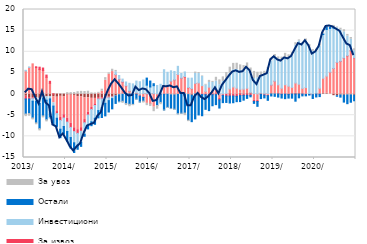
| Category | По трансакционим рачунима | За ликвидност и обртна средства  | За извоз | Инвестициони | Остали | За увоз |
|---|---|---|---|---|---|---|
| 2013-01-01 | -0.509 | 5.466 | -0.655 | 0.157 | -3.557 | -0.62 |
| 2013-02-01 | -0.821 | 6.307 | -0.351 | 0.101 | -3.442 | -0.636 |
| 2013-03-01 | -0.908 | 7.144 | -0.174 | -0.604 | -3.955 | -0.473 |
| 2013-04-01 | -0.906 | 6.265 | 0.188 | -0.805 | -5.11 | -0.441 |
| 2013-05-01 | -1.028 | 5.791 | 0.566 | -1.205 | -5.942 | -0.539 |
| 2013-06-01 | -0.715 | 5.566 | 0.59 | -0.246 | -4.209 | -0.467 |
| 2013-07-01 | -0.656 | 3.962 | 0.527 | -0.788 | -4.619 | -0.522 |
| 2013-08-01 | -0.571 | 2.543 | 0.475 | -0.574 | -4.455 | -0.211 |
| 2013-09-01 | -0.597 | -1.463 | 0.046 | -0.788 | -4.325 | -0.17 |
| 2013-10-01 | -0.731 | -3.405 | -0.479 | -1.101 | -1.998 | -0.034 |
| 2013-11-01 | -0.534 | -5.012 | -0.697 | -2.071 | -1.999 | 0.032 |
| 2013-12-01 | -0.631 | -4.25 | -0.793 | -2 | -1.812 | 0.042 |
| 2014-01-01 | -0.248 | -5.468 | -0.921 | -2.223 | -2.314 | 0.338 |
| 2014-02-01 | -0.244 | -6.677 | -0.967 | -2.397 | -2.478 | 0.345 |
| 2014-03-01 | -0.312 | -7.664 | -0.914 | -2.634 | -2.299 | 0.368 |
| 2014-04-01 | -0.598 | -7.82 | -0.878 | -2.779 | -0.977 | 0.561 |
| 2014-05-01 | -0.678 | -7.271 | -0.835 | -2.63 | -0.953 | 0.634 |
| 2014-06-01 | -0.89 | -5.133 | -0.763 | -2.735 | -0.458 | 0.61 |
| 2014-07-01 | -0.861 | -3.427 | -0.672 | -2.518 | -0.758 | 0.681 |
| 2014-08-01 | -1.004 | -2.174 | -0.467 | -2.918 | -0.917 | 0.276 |
| 2014-09-01 | -1.021 | -1.308 | -0.375 | -3.018 | -1.426 | 0.243 |
| 2014-10-01 | -0.819 | 0.161 | -0.34 | -2.752 | -1.718 | 0.247 |
| 2014-11-01 | -0.858 | 0.695 | -0.279 | -2.093 | -2.317 | 0.459 |
| 2014-12-01 | -0.577 | 3.263 | -0.264 | -1.35 | -2.967 | 0.625 |
| 2015-01-01 | -0.712 | 4.673 | -0.142 | -0.704 | -2.68 | 0.34 |
| 2015-02-01 | -0.565 | 5.321 | -0.111 | -0.407 | -2.409 | 0.553 |
| 2015-03-01 | -0.434 | 4.59 | 0.008 | 0.669 | -1.773 | 0.324 |
| 2015-04-01 | -0.175 | 3.498 | 0.044 | 0.845 | -1.638 | -0.132 |
| 2015-05-01 | -0.054 | 2.82 | 0.068 | 0.654 | -1.651 | -0.488 |
| 2015-06-01 | 0.05 | 1.84 | 0.063 | 0.904 | -2.258 | -0.459 |
| 2015-07-01 | 0.129 | 0.502 | 0.07 | 1.849 | -2.403 | -0.592 |
| 2015-08-01 | 0.104 | 0.009 | -0.067 | 2.291 | -2.376 | -0.307 |
| 2015-09-01 | 0.112 | 0.208 | -0.055 | 2.751 | -1.148 | -0.214 |
| 2015-10-01 | 0.038 | -0.411 | -0.06 | 2.883 | -1.421 | -0.215 |
| 2015-11-01 | 0.131 | -0.703 | -0.076 | 3.2 | -0.895 | -0.44 |
| 2015-12-01 | 0.06 | -2.198 | 0.008 | 2.045 | 1.664 | -0.542 |
| 2016-01-01 | 0.112 | -2.269 | -0.03 | 1.566 | 1.404 | -0.65 |
| 2016-02-01 | 0.086 | -3.097 | 0.005 | 1.894 | 0.462 | -1.069 |
| 2016-03-01 | 0.054 | -1.187 | -0.022 | 1.97 | -1.494 | -0.878 |
| 2016-04-01 | 0.002 | 0.259 | -0.024 | 2.055 | -1.952 | -0.542 |
| 2016-05-01 | -0.049 | 2.232 | -0.014 | 3.525 | -3.719 | -0.201 |
| 2016-06-01 | -0.049 | 2.038 | 0.004 | 3.11 | -3.101 | -0.262 |
| 2016-07-01 | -0.188 | 3.046 | 0.004 | 2.456 | -3.237 | -0.159 |
| 2016-08-01 | -0.222 | 3.353 | 0.003 | 1.994 | -3.361 | -0.259 |
| 2016-09-01 | -0.107 | 4.637 | 0.003 | 1.923 | -4.549 | -0.209 |
| 2016-10-01 | -0.069 | 3.752 | 0.02 | 1.099 | -4.471 | -0.197 |
| 2016-11-01 | 0.003 | 4.032 | 0.118 | 1.076 | -4.499 | -0.6 |
| 2016-12-01 | -0.126 | 1.493 | 0.07 | 2.199 | -6.059 | -0.332 |
| 2017-01-01 | -0.287 | 1.255 | 0.034 | 2.468 | -6.239 | 0.016 |
| 2017-02-01 | -0.028 | 2.502 | 0.033 | 2.337 | -5.845 | 0.328 |
| 2017-03-01 | -0.212 | 2.639 | -0.061 | 2.218 | -4.66 | 0.242 |
| 2017-04-01 | 0.006 | 1.986 | -0.118 | 2.178 | -5.005 | 0.123 |
| 2017-05-01 | -0.021 | 0.622 | -0.131 | 1.488 | -3.457 | 0.202 |
| 2017-06-01 | -0.058 | 1.637 | -0.146 | 1.1 | -3.715 | 0.504 |
| 2017-07-01 | 0.066 | 0.742 | -0.146 | 1.936 | -2.615 | 0.257 |
| 2017-08-01 | 0.095 | 1.091 | -0.147 | 1.891 | -2.348 | 0.891 |
| 2017-09-01 | -0.033 | -1.003 | -0.338 | 2.229 | -1.931 | 1.128 |
| 2017-10-01 | 0.035 | -0.002 | -0.349 | 2.95 | -1.675 | 1.076 |
| 2017-11-01 | -0.038 | 0.191 | -0.423 | 3.298 | -1.519 | 1.614 |
| 2017-12-01 | 0.111 | 1.115 | -0.472 | 3.68 | -1.636 | 1.452 |
| 2018-01-01 | -0.017 | 1.678 | -0.449 | 4.093 | -1.582 | 1.485 |
| 2018-02-01 | -0.076 | 1.395 | -0.446 | 4.432 | -1.275 | 1.464 |
| 2018-03-01 | 0.181 | 0.968 | -0.353 | 4.465 | -1.426 | 1.286 |
| 2018-04-01 | 0.071 | 1.103 | -0.297 | 4.181 | -1.141 | 1.381 |
| 2018-05-01 | 0.137 | 1.251 | -0.296 | 4.4 | -0.726 | 1.574 |
| 2018-06-01 | 0.284 | 0.134 | -0.277 | 4.559 | -0.377 | 1.191 |
| 2018-07-01 | 0.145 | -1.444 | -0.282 | 3.523 | -0.476 | 1.691 |
| 2018-08-01 | 0.047 | -1.482 | -0.277 | 3.826 | -1.138 | 1.281 |
| 2018-09-01 | 0.187 | 0.07 | -0.088 | 3.999 | -0.981 | 0.962 |
| 2018-10-01 | 0.165 | -0.154 | -0.086 | 4.312 | -0.67 | 0.902 |
| 2018-11-01 | 0.151 | -0.294 | -0.083 | 5.778 | -1.1 | 0.383 |
| 2018-12-01 | 0.121 | 2.002 | 0.005 | 5.72 | -0.449 | 0.69 |
| 2019-01-01 | 0.084 | 2.964 | 0.003 | 5.799 | -0.532 | 0.511 |
| 2019-02-01 | 0.122 | 2.071 | -0.001 | 6.112 | -0.71 | 0.483 |
| 2019-03-01 | -0.043 | 1.384 | -0.007 | 6.432 | -0.89 | 0.926 |
| 2019-04-01 | -0.017 | 2.209 | -0.007 | 6.458 | -1.061 | 0.975 |
| 2019-05-01 | -0.065 | 1.864 | -0.007 | 6.82 | -0.881 | 0.597 |
| 2019-06-01 | 0.071 | 1.52 | -0.011 | 7.649 | -0.954 | 0.599 |
| 2019-07-01 | 0.174 | 2.439 | -0.011 | 8.965 | -1.672 | 0.577 |
| 2019-08-01 | 0.114 | 2.222 | -0.011 | 10.233 | -0.877 | 0.238 |
| 2019-09-01 | 0.013 | 1.329 | -0.011 | 10.479 | -0.423 | 0.206 |
| 2019-10-31 | -0.066 | 1.541 | -0.01 | 11.047 | -0.342 | 0.436 |
| 2019-11-30 | -0.091 | 0.084 | -0.01 | 10.759 | -0.137 | 0.843 |
| 2019-12-31 | -0.112 | -0.022 | -0.01 | 10.098 | -0.896 | 0.408 |
| 2020-01-31 | 0.054 | 0.141 | -0.01 | 9.923 | -0.677 | 0.532 |
| 2020-02-29 | -0.038 | 1.384 | -0.005 | 9.987 | -0.557 | 0.483 |
| 2020-03-31 | 0.142 | 3.609 | 0 | 10.341 | 0.142 | 0.224 |
| 2020-04-30 | 0.16 | 4.087 | 0 | 11.041 | 0.559 | 0.149 |
| 2020-05-31 | -0.034 | 5.187 | 0.005 | 10.338 | 0.308 | 0.306 |
| 2020-06-30 | -0.38 | 6.042 | 0.022 | 9.534 | 0.223 | 0.414 |
| 2020-07-31 | -0.388 | 7.439 | 0.076 | 8.138 | -0.127 | 0.2 |
| 2020-08-31 | -0.211 | 7.694 | 0.075 | 7.348 | -0.512 | 0.459 |
| 2020-09-30 | -0.276 | 8.456 | 0.072 | 6.174 | -1.624 | 0.508 |
| 2020-10-31 | -0.209 | 9.015 | 0.061 | 4.618 | -2.062 | 0.415 |
| 2020-11-30 | -0.198 | 10.255 | 0.062 | 2.65 | -1.729 | 0.415 |
| 2020-12-31 | -0.289 | 8.535 | 0.053 | 1.681 | -1.31 | 0.431 |